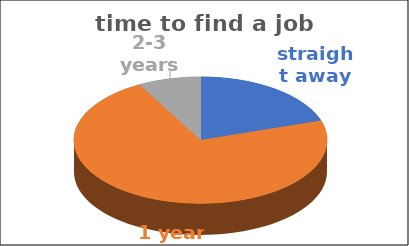
| Category | time to find a job | Series 1 | Series 2 | Series 3 | Series 4 |
|---|---|---|---|---|---|
| straight away | 0.2 |  |  |  |  |
| 1 year | 0.72 |  |  |  |  |
| 2-3 years | 0.08 |  |  |  |  |